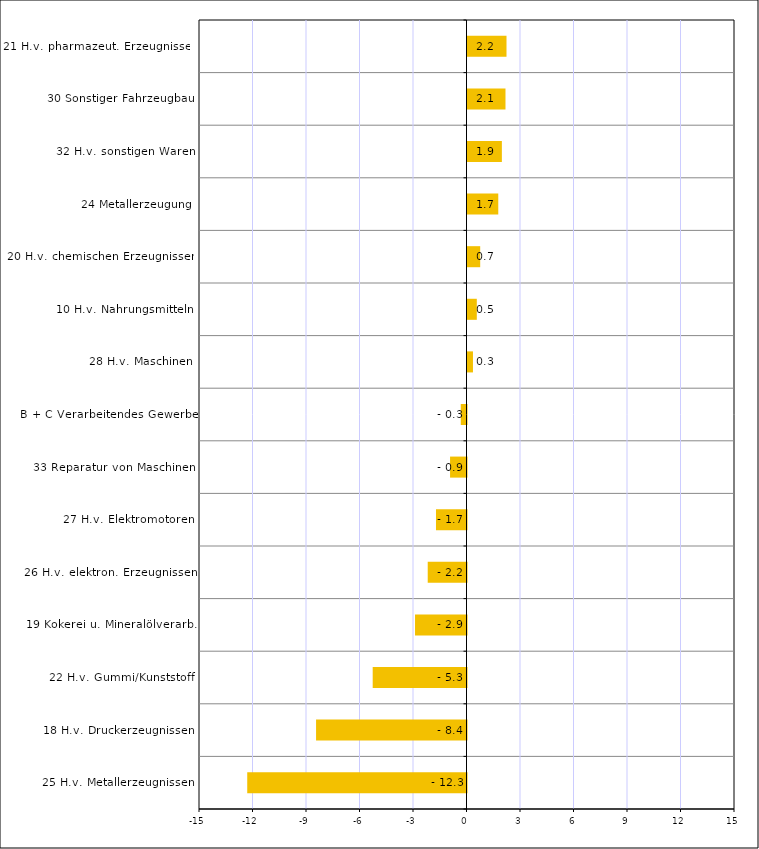
| Category | Series 0 |
|---|---|
| 25 H.v. Metallerzeugnissen | -12.295 |
| 18 H.v. Druckerzeugnissen | -8.436 |
| 22 H.v. Gummi/Kunststoff | -5.26 |
| 19 Kokerei u. Mineralölverarb. | -2.886 |
| 26 H.v. elektron. Erzeugnissen | -2.174 |
| 27 H.v. Elektromotoren | -1.711 |
| 33 Reparatur von Maschinen | -0.922 |
| B + C Verarbeitendes Gewerbe | -0.321 |
| 28 H.v. Maschinen | 0.306 |
| 10 H.v. Nahrungsmitteln | 0.522 |
| 20 H.v. chemischen Erzeugnissen | 0.712 |
| 24 Metallerzeugung | 1.725 |
| 32 H.v. sonstigen Waren | 1.927 |
| 30 Sonstiger Fahrzeugbau | 2.13 |
| 21 H.v. pharmazeut. Erzeugnissen | 2.187 |